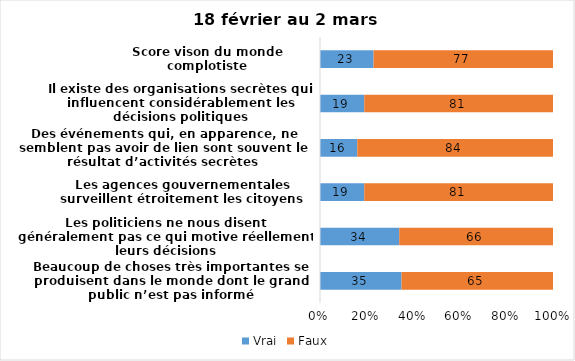
| Category | Vrai | Faux |
|---|---|---|
| Beaucoup de choses très importantes se produisent dans le monde dont le grand public n’est pas informé | 35 | 65 |
| Les politiciens ne nous disent généralement pas ce qui motive réellement leurs décisions | 34 | 66 |
| Les agences gouvernementales surveillent étroitement les citoyens | 19 | 81 |
| Des événements qui, en apparence, ne semblent pas avoir de lien sont souvent le résultat d’activités secrètes | 16 | 84 |
| Il existe des organisations secrètes qui influencent considérablement les décisions politiques | 19 | 81 |
| Score vison du monde complotiste | 23 | 77 |